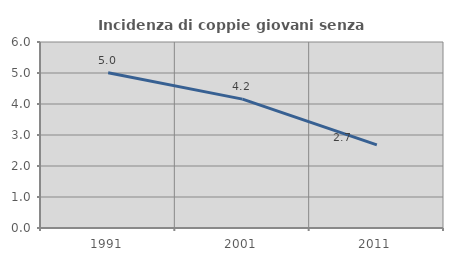
| Category | Incidenza di coppie giovani senza figli |
|---|---|
| 1991.0 | 5.011 |
| 2001.0 | 4.157 |
| 2011.0 | 2.681 |